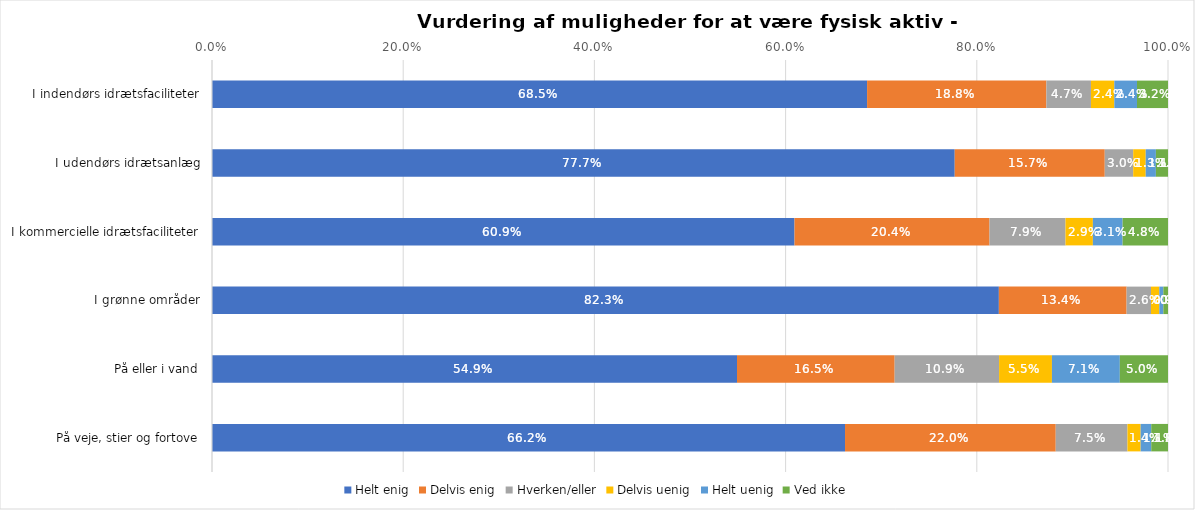
| Category | Helt enig | Delvis enig | Hverken/eller | Delvis uenig | Helt uenig | Ved ikke |
|---|---|---|---|---|---|---|
| I indendørs idrætsfaciliteter | 0.685 | 0.188 | 0.047 | 0.024 | 0.024 | 0.032 |
| I udendørs idrætsanlæg | 0.777 | 0.157 | 0.03 | 0.013 | 0.011 | 0.013 |
| I kommercielle idrætsfaciliteter | 0.609 | 0.204 | 0.079 | 0.029 | 0.031 | 0.048 |
| I grønne områder | 0.823 | 0.134 | 0.026 | 0.009 | 0.004 | 0.005 |
| På eller i vand | 0.549 | 0.165 | 0.109 | 0.055 | 0.071 | 0.05 |
| På veje, stier og fortove | 0.662 | 0.22 | 0.075 | 0.014 | 0.011 | 0.018 |